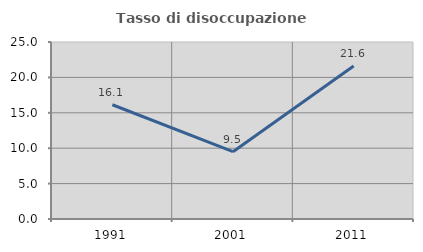
| Category | Tasso di disoccupazione giovanile  |
|---|---|
| 1991.0 | 16.135 |
| 2001.0 | 9.509 |
| 2011.0 | 21.61 |